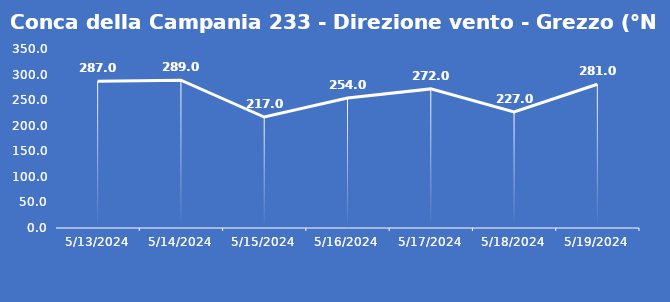
| Category | Conca della Campania 233 - Direzione vento - Grezzo (°N) |
|---|---|
| 5/13/24 | 287 |
| 5/14/24 | 289 |
| 5/15/24 | 217 |
| 5/16/24 | 254 |
| 5/17/24 | 272 |
| 5/18/24 | 227 |
| 5/19/24 | 281 |